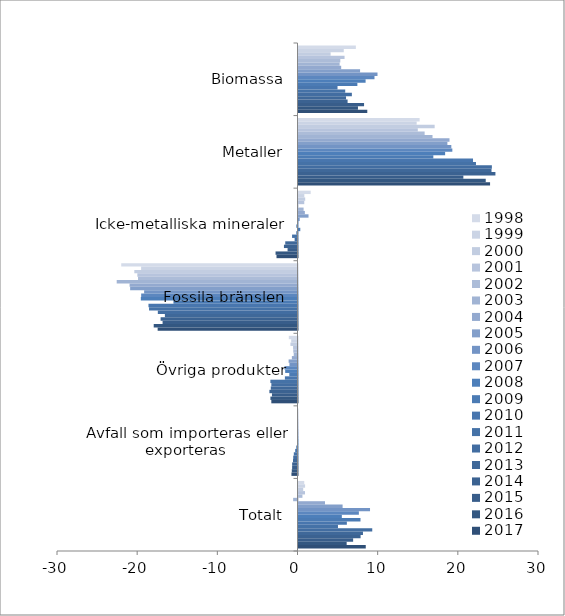
| Category | 1998 | 1999 | 2000 | 2001 | 2002 | 2003 | 2004 | 2005 | 2006 | 2007 | 2008 | 2009 | 2010 | 2011 | 2012 | 2013 | 2014 | 2015 | 2016 | 2017 |
|---|---|---|---|---|---|---|---|---|---|---|---|---|---|---|---|---|---|---|---|---|
| Biomassa | 7.155 | 5.646 | 4.006 | 5.745 | 5.214 | 5.129 | 5.324 | 7.68 | 9.854 | 9.479 | 8.37 | 7.344 | 4.868 | 5.828 | 6.657 | 5.93 | 6.124 | 8.178 | 7.418 | 8.58 |
| Metaller | 15.11 | 14.74 | 16.983 | 14.88 | 15.735 | 16.716 | 18.835 | 18.572 | 19.062 | 19.19 | 18.291 | 16.819 | 21.769 | 22.139 | 24.122 | 24.076 | 24.563 | 20.564 | 23.355 | 23.896 |
| Icke-metalliska mineraler | 1.521 | 0.726 | 0.835 | 0.719 | -0.034 | 0.636 | 0.795 | 1.249 | 0.15 | 0.005 | -0.148 | 0.223 | -0.152 | -0.679 | -0.36 | -1.529 | -1.692 | -1.239 | -2.738 | -2.619 |
| Fossila bränslen | -21.988 | -19.506 | -20.354 | -19.978 | -19.893 | -22.552 | -20.945 | -20.876 | -19.131 | -19.5 | -19.543 | -15.474 | -18.591 | -18.518 | -17.422 | -16.543 | -17.077 | -16.83 | -17.935 | -17.445 |
| Övriga produkter | -1.083 | -0.784 | -0.882 | -0.553 | -0.531 | -0.472 | -0.702 | -1.108 | -1.006 | -1.629 | -1.537 | -1.024 | -1.573 | -3.384 | -3.263 | -3.334 | -3.507 | -3.187 | -3.379 | -3.265 |
| Avfall som importeras eller exporteras | 0 | 0 | 0 | 0 | -0.002 | -0.002 | -0.002 | -0.017 | -0.008 | -0.013 | -0.027 | -0.156 | -0.29 | -0.46 | -0.534 | -0.56 | -0.667 | -0.671 | -0.712 | -0.756 |
| Totalt | 0.715 | 0.822 | 0.588 | 0.812 | 0.49 | -0.545 | 3.305 | 5.501 | 8.921 | 7.531 | 5.405 | 7.731 | 6.032 | 4.925 | 9.2 | 8.041 | 7.745 | 6.815 | 6.008 | 8.39 |